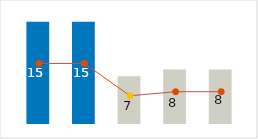
| Category | Profit |
|---|---|
| 0 | 15 |
| 1 | 15 |
| 2 | 7 |
| 3 | 8 |
| 4 | 8 |